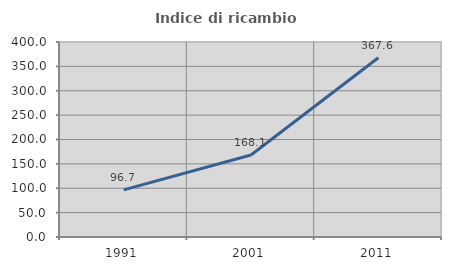
| Category | Indice di ricambio occupazionale  |
|---|---|
| 1991.0 | 96.666 |
| 2001.0 | 168.123 |
| 2011.0 | 367.603 |